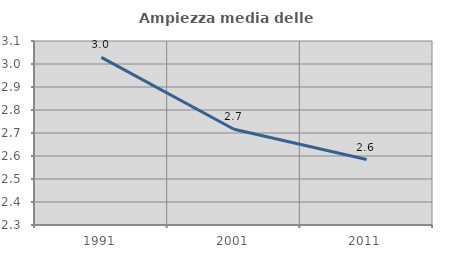
| Category | Ampiezza media delle famiglie |
|---|---|
| 1991.0 | 3.029 |
| 2001.0 | 2.716 |
| 2011.0 | 2.584 |